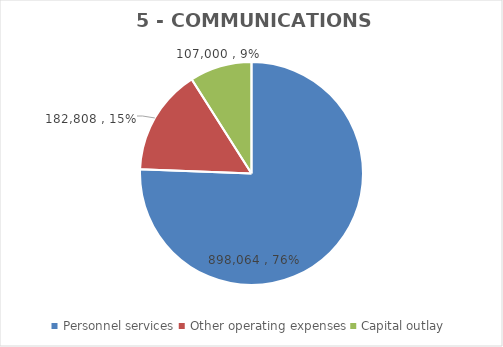
| Category | Series 0 | Series 1 | Series 2 | Series 3 | Series 4 | Series 5 | Series 6 |
|---|---|---|---|---|---|---|---|
| Personnel services | 898064 |  |  | 733635 | 847045 | 898077 | 898064 |
| Other operating expenses | 182808 |  |  | 104302 | 130969 | 183808 | 182808 |
| Capital outlay | 107000 |  |  | 635217 | 869764 | 107000 | 107000 |